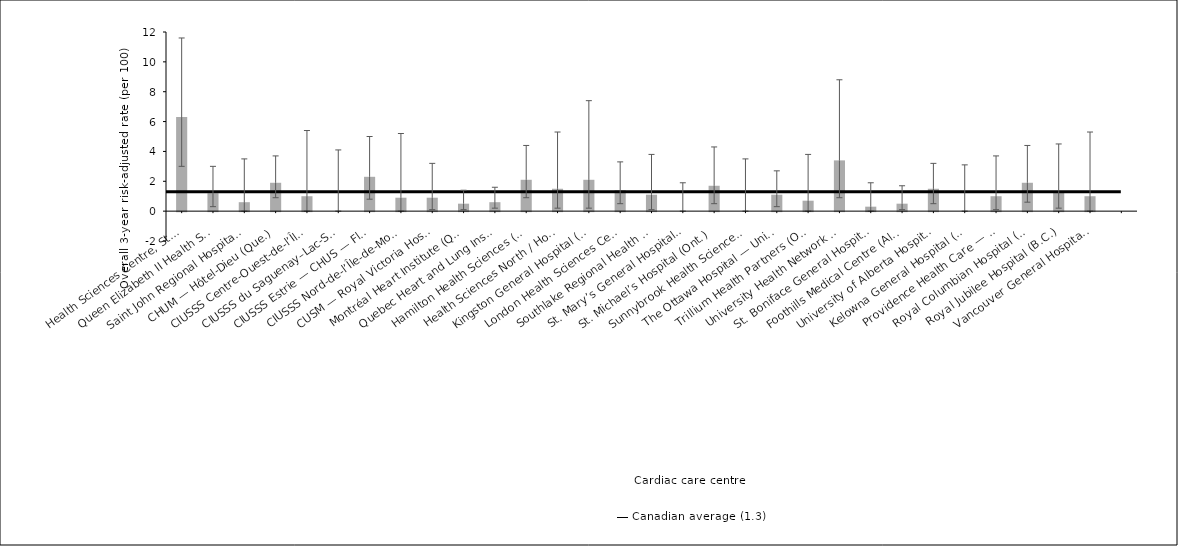
| Category | Risk-adjusted rate |
|---|---|
| Health Sciences Centre, St. John’s* (N.L.) | 6.3 |
| Queen Elizabeth II Health Sciences Centre (N.S.) | 1.2 |
| Saint John Regional Hospital (N.B.) | 0.6 |
| CHUM — Hôtel-Dieu (Que.) | 1.9 |
| CIUSSS Centre-Ouest-de-l’Île-de-Montréal — Jewish General Hospital (Que.) | 1 |
| CIUSSS du Saguenay–Lac-St-Jean — Chicoutimi Hospital (Que.) | 0 |
| CIUSSS Estrie — CHUS — Fleurimont Hospital (Que.) | 2.3 |
| CIUSSS Nord-de-l’Île-de-Montréal — Montréal Sacré-Coeur Hospital (Que.) | 0.9 |
| CUSM — Royal Victoria Hospital (Que.) | 0.9 |
| Montréal Heart Institute (Que.) | 0.5 |
| Quebec Heart and Lung Institute (Que.) | 0.6 |
| Hamilton Health Sciences (Ont.) | 2.1 |
| Health Sciences North / Horizon Santé-Nord (Ont.) | 1.5 |
| Kingston General Hospital (Ont.) | 2.1 |
| London Health Sciences Centre (Ont.) | 1.4 |
| Southlake Regional Health Centre (Ont.) | 1.1 |
| St. Mary’s General Hospital (Ont.) | 0 |
| St. Michael’s Hospital (Ont.) | 1.7 |
| Sunnybrook Health Sciences Centre (Ont.) | 0 |
| The Ottawa Hospital — University of Ottawa Heart Institute (Ont.) | 1.1 |
| Trillium Health Partners (Ont.) | 0.7 |
| University Health Network (Ont.) | 3.4 |
| St. Boniface General Hospital (Man.) | 0.3 |
| Foothills Medical Centre (Alta.) | 0.5 |
| University of Alberta Hospital (Alta.) | 1.5 |
| Kelowna General Hospital (B.C.) | 0 |
| Providence Health Care — St. Paul’s Hospital (Vancouver) (B.C.) | 1 |
| Royal Columbian Hospital (B.C.) | 1.9 |
| Royal Jubilee Hospital (B.C.) | 1.3 |
| Vancouver General Hospital (B.C.) | 1 |